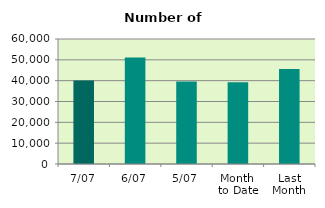
| Category | Series 0 |
|---|---|
| 7/07 | 40062 |
| 6/07 | 51168 |
| 5/07 | 39590 |
| Month 
to Date | 39260.8 |
| Last
Month | 45645.364 |